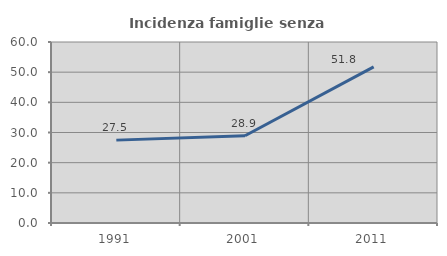
| Category | Incidenza famiglie senza nuclei |
|---|---|
| 1991.0 | 27.473 |
| 2001.0 | 28.916 |
| 2011.0 | 51.765 |